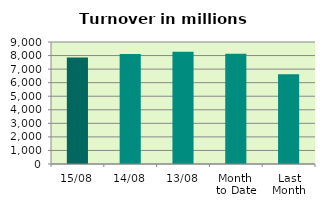
| Category | Series 0 |
|---|---|
| 15/08 | 7863.112 |
| 14/08 | 8106.749 |
| 13/08 | 8282.703 |
| Month 
to Date | 8137.295 |
| Last
Month | 6625.077 |